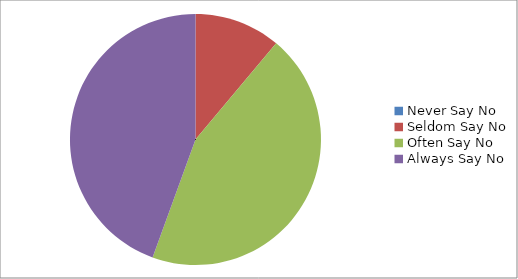
| Category | Series 0 |
|---|---|
| Never Say No | 0 |
| Seldom Say No | 1 |
| Often Say No | 4 |
| Always Say No | 4 |